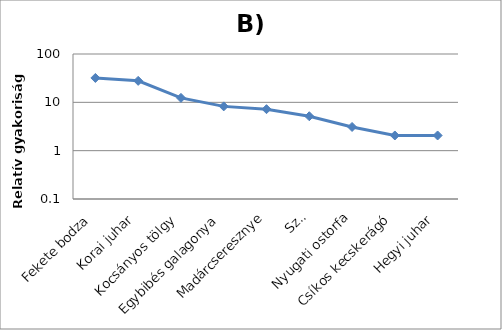
| Category | Series 0 |
|---|---|
| Fekete bodza | 31.959 |
| Korai juhar | 27.835 |
| Kocsányos tölgy | 12.371 |
| Egybibés galagonya | 8.247 |
| Madárcseresznye | 7.216 |
| Szil | 5.155 |
| Nyugati ostorfa | 3.093 |
| Csíkos kecskerágó | 2.062 |
| Hegyi juhar | 2.062 |